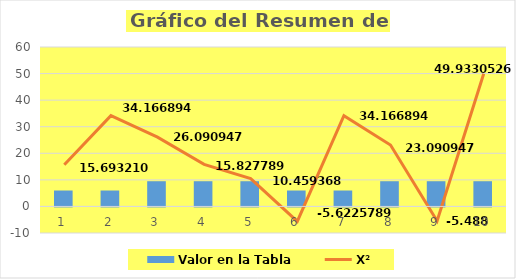
| Category | Valor en la Tabla  |
|---|---|
| 0 | 5.991 |
| 1 | 5.991 |
| 2 | 9.488 |
| 3 | 9.488 |
| 4 | 9.488 |
| 5 | 5.991 |
| 6 | 5.991 |
| 7 | 9.488 |
| 8 | 9.488 |
| 9 | 9.488 |